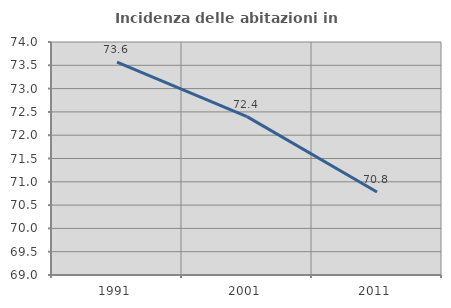
| Category | Incidenza delle abitazioni in proprietà  |
|---|---|
| 1991.0 | 73.568 |
| 2001.0 | 72.398 |
| 2011.0 | 70.78 |